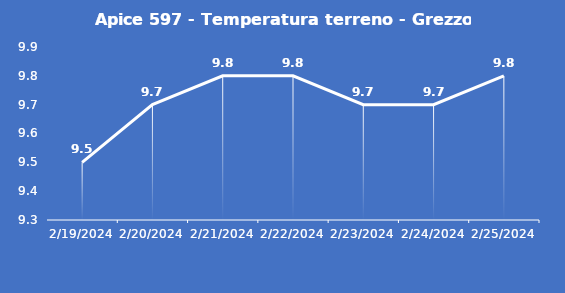
| Category | Apice 597 - Temperatura terreno - Grezzo (°C) |
|---|---|
| 2/19/24 | 9.5 |
| 2/20/24 | 9.7 |
| 2/21/24 | 9.8 |
| 2/22/24 | 9.8 |
| 2/23/24 | 9.7 |
| 2/24/24 | 9.7 |
| 2/25/24 | 9.8 |